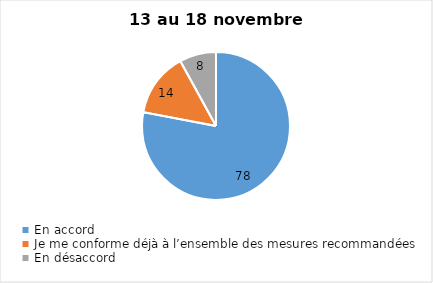
| Category | Series 0 |
|---|---|
| En accord | 78 |
| Je me conforme déjà à l’ensemble des mesures recommandées | 14 |
| En désaccord | 8 |